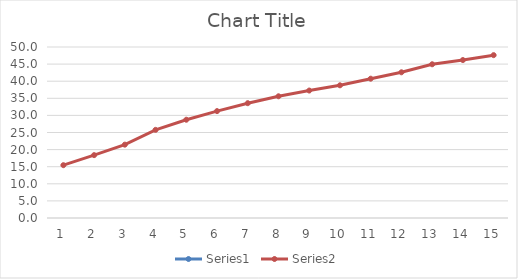
| Category | Series 0 | Series 1 |
|---|---|---|
| 0 |  | 15.443 |
| 1 |  | 18.384 |
| 2 |  | 21.447 |
| 3 |  | 25.773 |
| 4 |  | 28.735 |
| 5 |  | 31.256 |
| 6 |  | 33.57 |
| 7 |  | 35.59 |
| 8 |  | 37.27 |
| 9 |  | 38.8 |
| 10 |  | 40.732 |
| 11 |  | 42.604 |
| 12 |  | 44.951 |
| 13 |  | 46.19 |
| 14 |  | 47.618 |